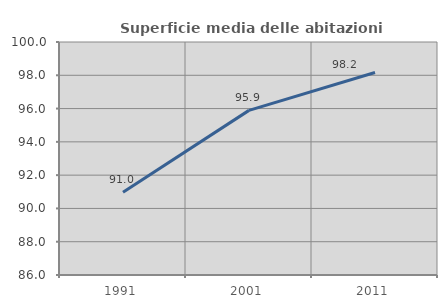
| Category | Superficie media delle abitazioni occupate |
|---|---|
| 1991.0 | 90.978 |
| 2001.0 | 95.892 |
| 2011.0 | 98.171 |